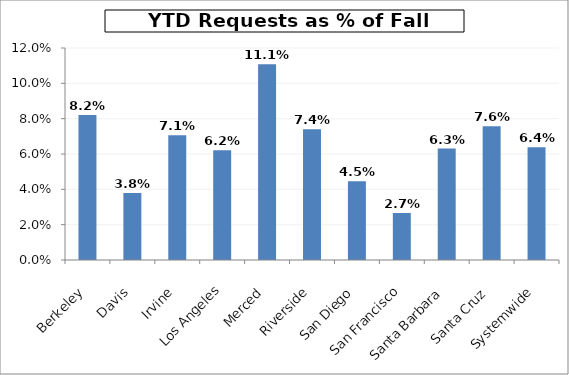
| Category | Series 0 |
|---|---|
| Berkeley | 0.082 |
| Davis | 0.038 |
| Irvine | 0.071 |
| Los Angeles | 0.062 |
| Merced | 0.111 |
| Riverside | 0.074 |
| San Diego | 0.045 |
| San Francisco | 0.027 |
| Santa Barbara | 0.063 |
| Santa Cruz | 0.076 |
| Systemwide | 0.064 |